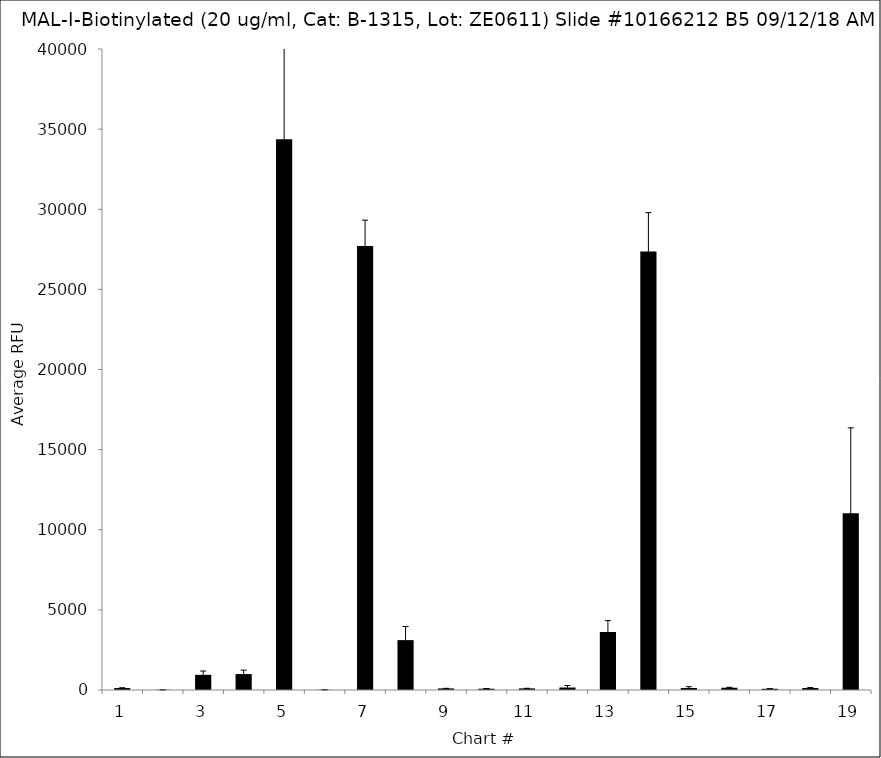
| Category | Series 0 |
|---|---|
| 1.0 | 122 |
| 2.0 | 11.5 |
| 3.0 | 947.5 |
| 4.0 | 995 |
| 5.0 | 34364 |
| 6.0 | 13 |
| 7.0 | 27707.25 |
| 8.0 | 3113 |
| 9.0 | 99 |
| 10.0 | 80 |
| 11.0 | 100.75 |
| 12.0 | 154.25 |
| 13.0 | 3617.5 |
| 14.0 | 27362.5 |
| 15.0 | 125.75 |
| 16.0 | 141 |
| 17.0 | 76.25 |
| 18.0 | 122.75 |
| 19.0 | 11034.75 |